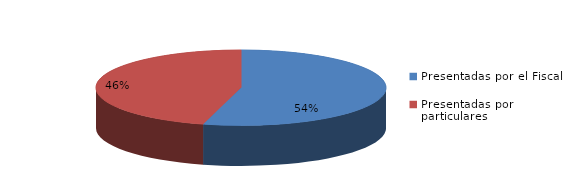
| Category | Series 0 |
|---|---|
| Presentadas por el Fiscal | 175 |
| Presentadas por particulares | 148 |